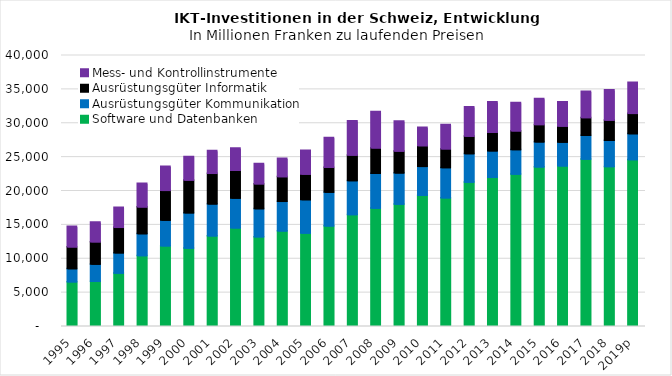
| Category | Software und Datenbanken | Ausrüstungsgüter Kommunikation | Ausrüstungsgüter Informatik  | Mess- und Kontrollinstrumente |
|---|---|---|---|---|
| 1995 | 6436.974 | 1932.607 | 3215.025 | 3013.026 |
| 1996 | 6505.206 | 2525.826 | 3306.745 | 2905.805 |
| 1997 | 7721.137 | 2992.353 | 3745.888 | 2942.249 |
| 1998 | 10290.014 | 3237.08 | 3951.646 | 3493.702 |
| 1999 | 11745.695 | 3777.255 | 4388.485 | 3574.735 |
| 2000 | 11397.467 | 5222.148 | 4824.11 | 3473.572 |
| 2001 | 13208.451 | 4711.946 | 4509.412 | 3351.724 |
| 2002 | 14388.685 | 4390.554 | 4094.445 | 3290.198 |
| 2003 | 13081.074 | 4139.164 | 3681.682 | 2964.209 |
| 2004 | 13932.139 | 4364.295 | 3653.253 | 2707.98 |
| 2005 | 13622.642 | 4923.677 | 3771.475 | 3512.966 |
| 2006 | 14670.94 | 4981.154 | 3665.483 | 4407.49 |
| 2007 | 16351.603 | 5008.272 | 3778.687 | 5050.358 |
| 2008 | 17292.851 | 5150.642 | 3744.536 | 5359.058 |
| 2009 | 17888.764 | 4609.07 | 3235.09 | 4414.029 |
| 2010 | 19189.062 | 4262.12 | 3065.567 | 2697.425 |
| 2011 | 18837.31 | 4446.192 | 2775.97 | 3579.996 |
| 2012 | 21153.184 | 4187.448 | 2577.624 | 4341.81 |
| 2013 | 21860.302 | 3909.083 | 2729.59 | 4488.356 |
| 2014 | 22331.28 | 3608.76 | 2768.95 | 4167.834 |
| 2015 | 23386.728 | 3699.743 | 2558.782 | 3817.776 |
| 2016 | 23534.812 | 3510.579 | 2367.3 | 3582.436 |
| 2017 | 24544.105 | 3508.73 | 2611.79 | 3888.984 |
| 2018 | 23440.773 | 3866.001 | 2982.477 | 4455.897 |
| 2019p | 24460.707 | 3826.583 | 2986.705 | 4594.081 |